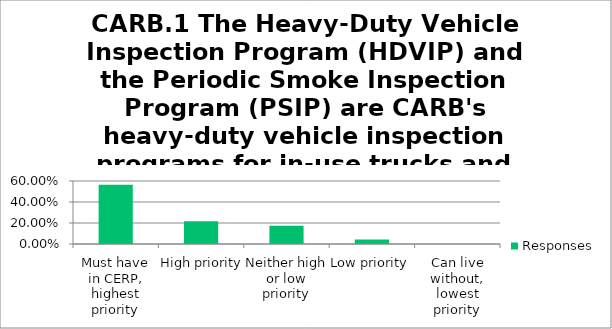
| Category | Responses |
|---|---|
| Must have in CERP, highest priority | 0.565 |
| High priority | 0.217 |
| Neither high or low priority | 0.174 |
| Low priority | 0.044 |
| Can live without, lowest priority | 0 |